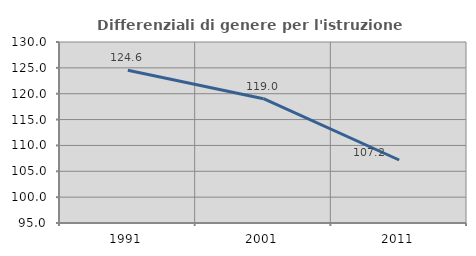
| Category | Differenziali di genere per l'istruzione superiore |
|---|---|
| 1991.0 | 124.552 |
| 2001.0 | 119.034 |
| 2011.0 | 107.183 |